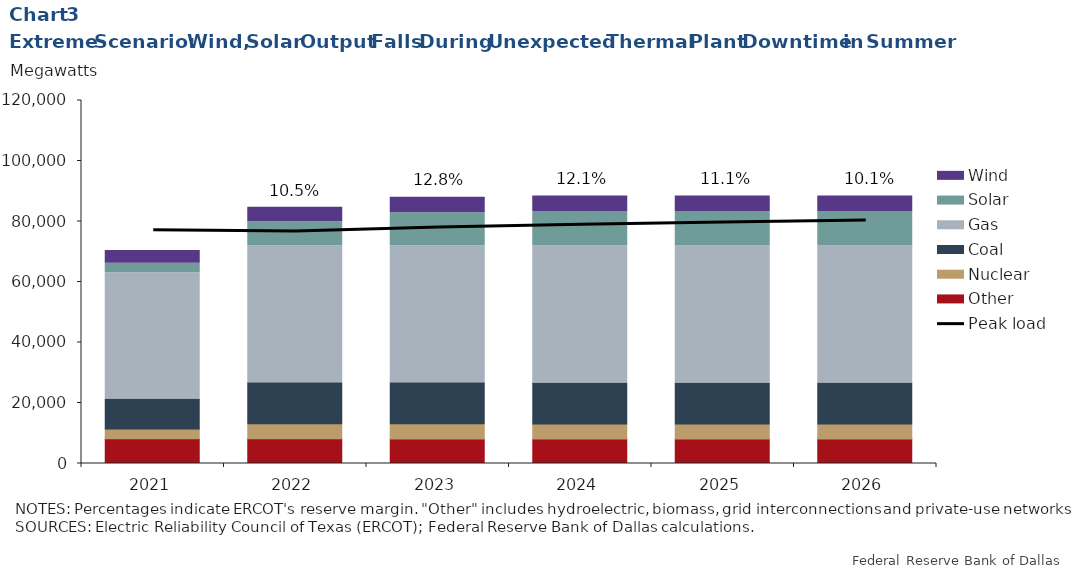
| Category | Other | Nuclear | Coal | Gas | Solar | Wind |
|---|---|---|---|---|---|---|
| 2021.0 | 8209.759 | 3173.2 | 9967.6 | 41689.3 | 3128.5 | 4283 |
| 2022.0 | 8180.641 | 4973.2 | 13567.6 | 45289.3 | 7872.44 | 4820.004 |
| 2023.0 | 8130.472 | 4973.2 | 13567.6 | 45289.3 | 10923.72 | 5132.276 |
| 2024.0 | 8083.472 | 4973.2 | 13567.6 | 45289.3 | 11395.68 | 5132.276 |
| 2025.0 | 8086.472 | 4973.2 | 13567.6 | 45289.3 | 11395.68 | 5132.276 |
| 2026.0 | 8089.472 | 4973.2 | 13567.6 | 45289.3 | 11395.68 | 5132.276 |